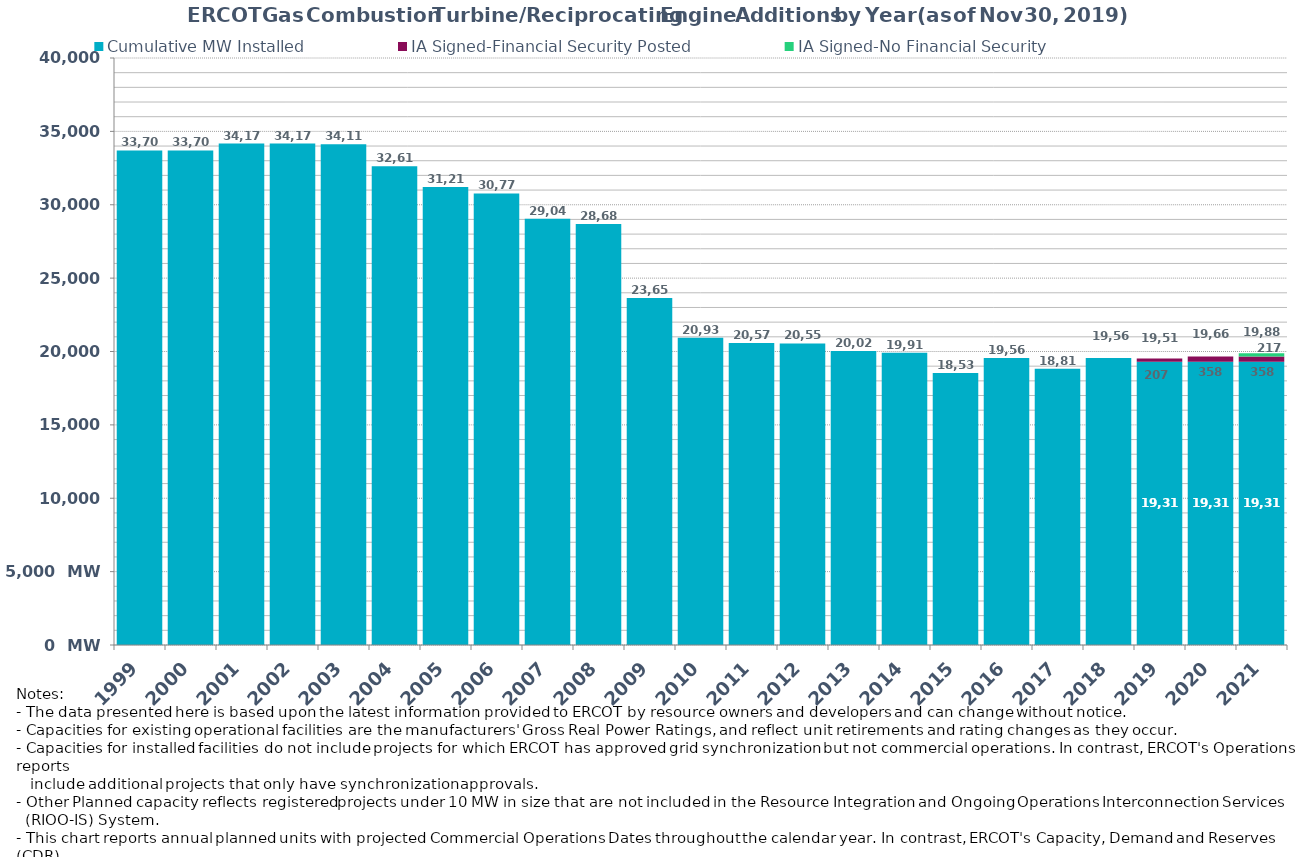
| Category | Cumulative MW Installed | IA Signed-Financial Security Posted  | IA Signed-No Financial Security  | Other Planned | Cumulative Installed and Planned |
|---|---|---|---|---|---|
| 1999.0 | 33703 | 0 | 0 | 0 | 33703 |
| 2000.0 | 33703 | 0 | 0 | 0 | 33703 |
| 2001.0 | 34170 | 0 | 0 | 0 | 34170 |
| 2002.0 | 34170 | 0 | 0 | 0 | 34170 |
| 2003.0 | 34118 | 0 | 0 | 0 | 34118 |
| 2004.0 | 32616 | 0 | 0 | 0 | 32616 |
| 2005.0 | 31217 | 0 | 0 | 0 | 31217 |
| 2006.0 | 30774 | 0 | 0 | 0 | 30774 |
| 2007.0 | 29048 | 0 | 0 | 0 | 29048 |
| 2008.0 | 28681 | 0 | 0 | 0 | 28681 |
| 2009.0 | 23651 | 0 | 0 | 0 | 23651 |
| 2010.0 | 20937 | 0 | 0 | 0 | 20937 |
| 2011.0 | 20575 | 0 | 0 | 0 | 20575 |
| 2012.0 | 20551 | 0 | 0 | 0 | 20551 |
| 2013.0 | 20026 | 0 | 0 | 0 | 20026 |
| 2014.0 | 19917 | 0 | 0 | 0 | 19917 |
| 2015.0 | 18538 | 0 | 0 | 0 | 18538 |
| 2016.0 | 19564 | 0 | 0 | 0 | 19564 |
| 2017.0 | 18818 | 0 | 0 | 0 | 18818 |
| 2018.0 | 19562 | 0 | 0 | 0 | 19562 |
| 2019.0 | 19309.7 | 207 | 0 | 0 | 19516.7 |
| 2020.0 | 19309.7 | 358 | 0 | 0 | 19667.7 |
| 2021.0 | 19309.7 | 358 | 217 | 0 | 19884.7 |